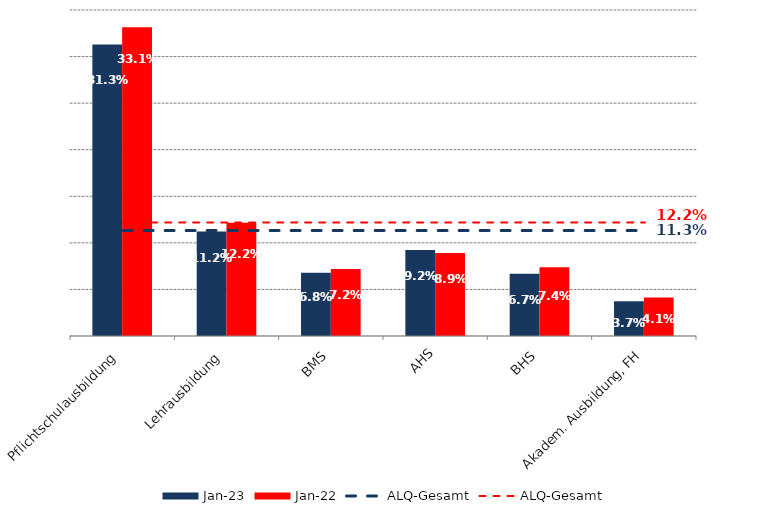
| Category | Jan 23 | Jan 22 |
|---|---|---|
| Pflichtschulausbildung | 0.313 | 0.331 |
| Lehrausbildung | 0.112 | 0.122 |
| BMS | 0.068 | 0.072 |
| AHS | 0.092 | 0.089 |
| BHS | 0.067 | 0.074 |
| Akadem. Ausbildung, FH | 0.037 | 0.041 |